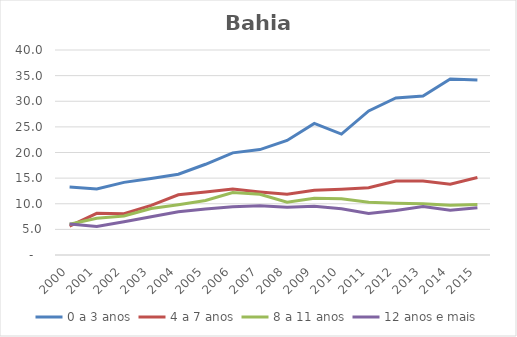
| Category | 0 a 3 anos | 4 a 7 anos | 8 a 11 anos | 12 anos e mais |
|---|---|---|---|---|
| 2000.0 | 13.26 | 5.652 | 5.999 | 6.037 |
| 2001.0 | 12.883 | 8.131 | 7.169 | 5.572 |
| 2002.0 | 14.168 | 8.061 | 7.615 | 6.483 |
| 2003.0 | 14.937 | 9.689 | 9.075 | 7.445 |
| 2004.0 | 15.768 | 11.745 | 9.825 | 8.418 |
| 2005.0 | 17.705 | 12.293 | 10.629 | 8.967 |
| 2006.0 | 19.926 | 12.866 | 12.202 | 9.409 |
| 2007.0 | 20.565 | 12.309 | 11.838 | 9.597 |
| 2008.0 | 22.348 | 11.87 | 10.28 | 9.313 |
| 2009.0 | 25.679 | 12.612 | 11.087 | 9.516 |
| 2010.0 | 23.586 | 12.805 | 10.997 | 9.023 |
| 2011.0 | 28.11 | 13.107 | 10.275 | 8.11 |
| 2012.0 | 30.652 | 14.444 | 10.12 | 8.681 |
| 2013.0 | 31.017 | 14.428 | 10.006 | 9.477 |
| 2014.0 | 34.333 | 13.829 | 9.697 | 8.751 |
| 2015.0 | 34.156 | 15.111 | 9.856 | 9.23 |